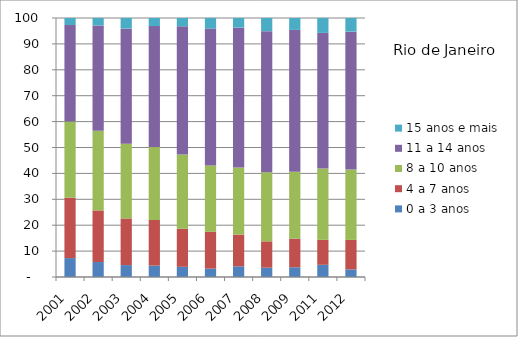
| Category | 0 a 3 anos | 4 a 7 anos | 8 a 10 anos | 11 a 14 anos | 15 anos e mais |
|---|---|---|---|---|---|
| 2001.0 | 7.3 | 23.32 | 29.4 | 37.26 | 2.74 |
| 2002.0 | 5.78 | 19.93 | 30.75 | 40.67 | 2.87 |
| 2003.0 | 4.6 | 18.01 | 28.85 | 44.43 | 4.11 |
| 2004.0 | 4.41 | 17.6 | 28.15 | 46.71 | 3.12 |
| 2005.0 | 3.93 | 14.7 | 28.65 | 49.49 | 3.23 |
| 2006.0 | 3.23 | 14.27 | 25.58 | 52.83 | 4.09 |
| 2007.0 | 4.13 | 12.25 | 25.86 | 54.03 | 3.73 |
| 2008.0 | 3.6 | 10.17 | 26.69 | 54.45 | 5.08 |
| 2009.0 | 3.75 | 11.09 | 25.82 | 54.74 | 4.61 |
| 2011.0 | 4.71 | 9.64 | 27.52 | 52.38 | 5.74 |
| 2012.0 | 2.93 | 11.39 | 27.16 | 53.25 | 5.27 |